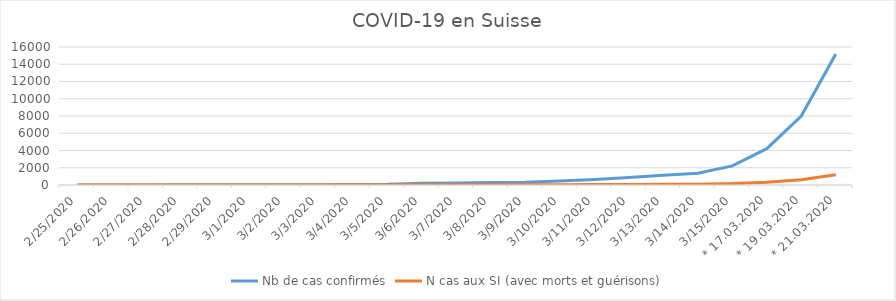
| Category | Nb de cas confirmés | N cas aux SI (avec morts et guérisons) |
|---|---|---|
| 25.02.2020 | 1 | 0 |
| 26.02.2020 | 1 | 0 |
| 27.02.2020 | 3 | 0 |
| 28.02.2020 | 15 | 1 |
| 29.02.2020 | 20 | 1 |
| 01.03.2020 | 25 | 1 |
| 02.03.2020 | 27 | 1 |
| 03.03.2020 | 37 | 2 |
| 04.03.2020 | 58 | 4 |
| 05.03.2020 | 87 | 6 |
| 06.03.2020 | 210 | 15.5 |
| 07.03.2020 | 246 | 18.5 |
| 08.03.2020 | 281 | 21.5 |
| 09.03.2020 | 312 | 23.5 |
| 10.03.2020 | 476 | 36 |
| 11.03.2020 | 645 | 49 |
| 12.03.2020 | 858 | 65 |
| 13.03.2020 | 1125 | 80.5 |
| 14.03.2020 | 1359 | 98 |
| 15.03.2020 | 2217 | 165.5 |
| * 17.03.2020 | 4212 | 324.5 |
| * 19.03.2020 | 8000 | 620.5 |
| * 21.03.2020 | 15200 | 1188.5 |